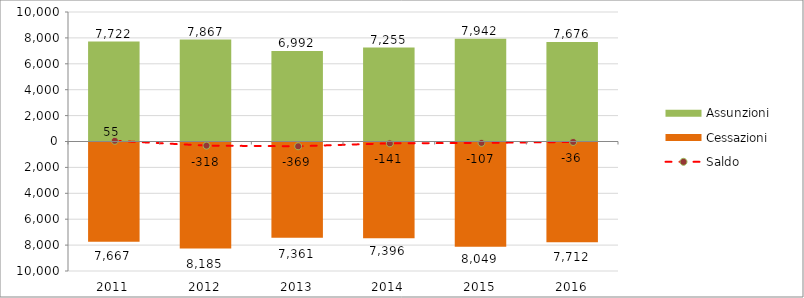
| Category | Assunzioni | Cessazioni |
|---|---|---|
| 2011.0 | 7722 | -7667 |
| 2012.0 | 7867 | -8185 |
| 2013.0 | 6992 | -7361 |
| 2014.0 | 7255 | -7396 |
| 2015.0 | 7942 | -8049 |
| 2016.0 | 7676 | -7712 |